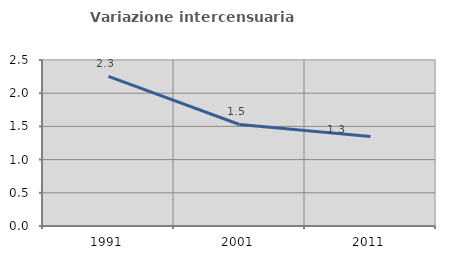
| Category | Variazione intercensuaria annua |
|---|---|
| 1991.0 | 2.254 |
| 2001.0 | 1.529 |
| 2011.0 | 1.348 |